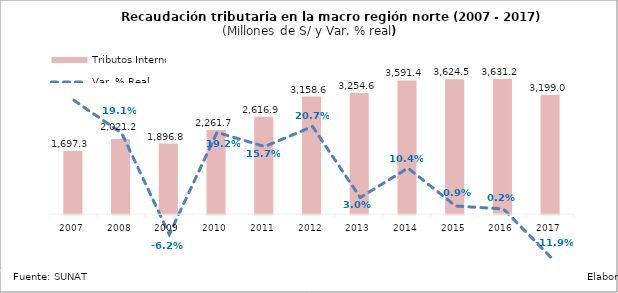
| Category | Tributos Internos |
|---|---|
| 2007.0 | 1697.333 |
| 2008.0 | 2021.228 |
| 2009.0 | 1896.767 |
| 2010.0 | 2261.681 |
| 2011.0 | 2616.906 |
| 2012.0 | 3158.562 |
| 2013.0 | 3254.554 |
| 2014.0 | 3591.408 |
| 2015.0 | 3624.451 |
| 2016.0 | 3631.247 |
| 2017.0 | 3198.96 |